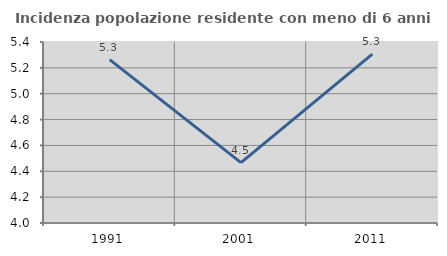
| Category | Incidenza popolazione residente con meno di 6 anni |
|---|---|
| 1991.0 | 5.263 |
| 2001.0 | 4.467 |
| 2011.0 | 5.307 |